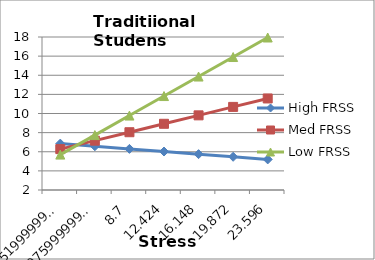
| Category | High FRSS | Med FRSS | Low FRSS |
|---|---|---|---|
| 1.251999999999999 | 6.851 | 6.277 | 5.702 |
| 4.975999999999999 | 6.576 | 7.159 | 7.743 |
| 8.7 | 6.3 | 8.042 | 9.784 |
| 12.424 | 6.024 | 8.925 | 11.825 |
| 16.148 | 5.749 | 9.807 | 13.866 |
| 19.872 | 5.473 | 10.69 | 15.906 |
| 23.596 | 5.198 | 11.572 | 17.947 |